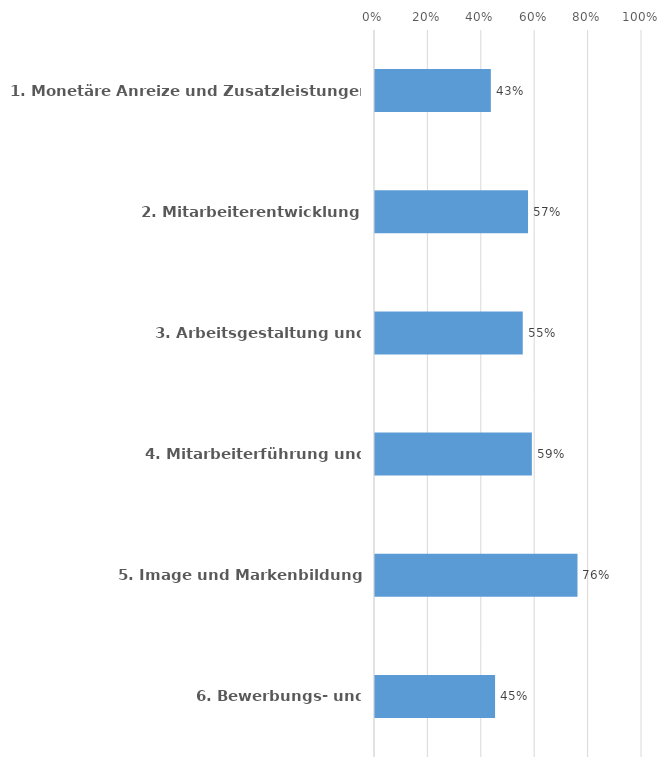
| Category | Series 0 |
|---|---|
| 1. Monetäre Anreize und Zusatzleistungen | 0.434 |
| 2. Mitarbeiterentwicklung | 0.573 |
| 3. Arbeitsgestaltung und Arbeitsorganisation | 0.553 |
| 4. Mitarbeiterführung und Unternehmenskultur | 0.587 |
| 5. Image und Markenbildung | 0.758 |
| 6. Bewerbungs- und Einstellungsverfahren | 0.45 |